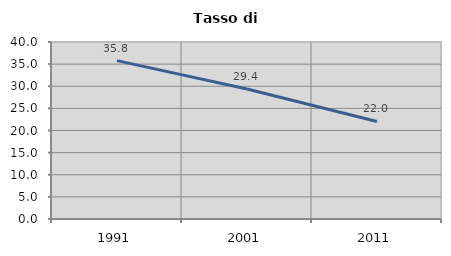
| Category | Tasso di disoccupazione   |
|---|---|
| 1991.0 | 35.784 |
| 2001.0 | 29.368 |
| 2011.0 | 22.035 |